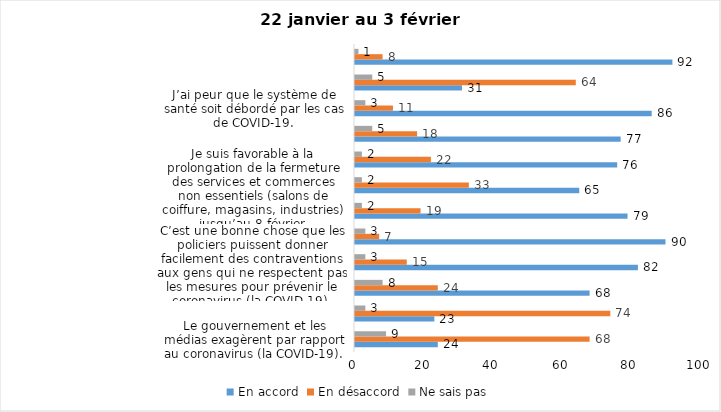
| Category | En accord | En désaccord | Ne sais pas |
|---|---|---|---|
| Le gouvernement et les médias exagèrent par rapport au coronavirus (la COVID-19). | 24 | 68 | 9 |
| Il est exagéré de rester chez soi pour se protéger contre le coronavirus (la COVID-19). | 23 | 74 | 3 |
| Les jeunes ne respectent pas les règles de confinement et contribuent à propager la COVID-19. | 68 | 24 | 8 |
| C’est une bonne chose que les policiers puissent donner facilement des contraventions aux gens qui ne respectent pas les mesures pour prévenir le coronavirus (la COVID-19). | 82 | 15 | 3 |
| La frontière entre le Canada et les États-Unis devrait être fermée au moins jusqu’en avril 2021. | 90 | 7 | 3 |
| Je suis favorable au port du masque ou du couvre-visage dans les
lieux publics extérieurs achalandés (ex. rues, parcs) | 79 | 19 | 2 |
| Je suis favorable à la prolongation de la fermeture des services et commerces non essentiels (salons de coiffure, magasins, industries) jusqu’au 8 février. | 65 | 33 | 2 |
| Je suis favorable à la mise en place d’un couvre-feu entre 20h et 5h. | 76 | 22 | 2 |
| J’ai peur que le renforcement du confinement dure plus longtemps que prévu. | 77 | 18 | 5 |
| J’ai peur que le système de santé soit débordé par les cas de COVID-19. | 86 | 11 | 3 |
| Les mesures actuelles sont suffisantes pour s’assurer que les voyageurs respectent leur quarantaine (14 jours d’isolement à la maison au retour d’un voyage). | 31 | 64 | 5 |
| Je suis favorable à ce que le gouvernement interdise tous les voyages non-essentiels. | 92 | 8 | 1 |